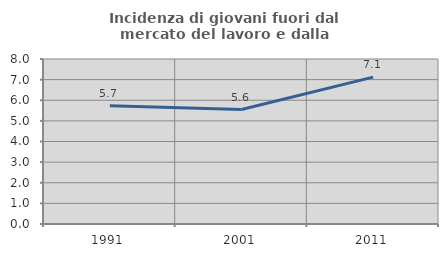
| Category | Incidenza di giovani fuori dal mercato del lavoro e dalla formazione  |
|---|---|
| 1991.0 | 5.731 |
| 2001.0 | 5.551 |
| 2011.0 | 7.12 |